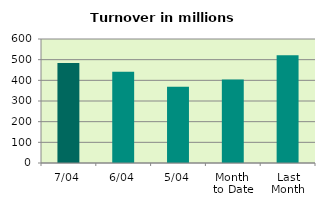
| Category | Series 0 |
|---|---|
| 7/04 | 484.082 |
| 6/04 | 441.06 |
| 5/04 | 369.367 |
| Month 
to Date | 403.85 |
| Last
Month | 521.26 |